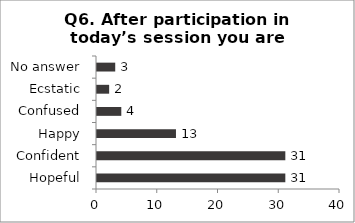
| Category | Q6. After participation in today’s session you are feeling? |
|---|---|
| Hopeful | 31 |
| Confident | 31 |
| Happy | 13 |
| Confused | 4 |
| Ecstatic | 2 |
| No answer | 3 |